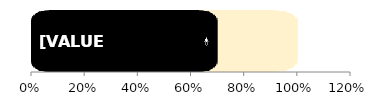
| Category | Total | Men |
|---|---|---|
| 0 | 1 | 0.699 |